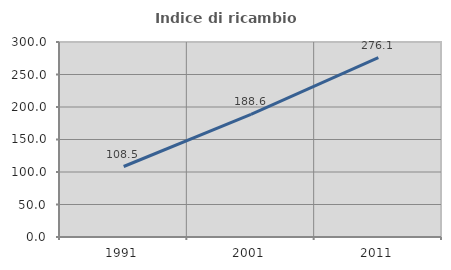
| Category | Indice di ricambio occupazionale  |
|---|---|
| 1991.0 | 108.451 |
| 2001.0 | 188.583 |
| 2011.0 | 276.103 |